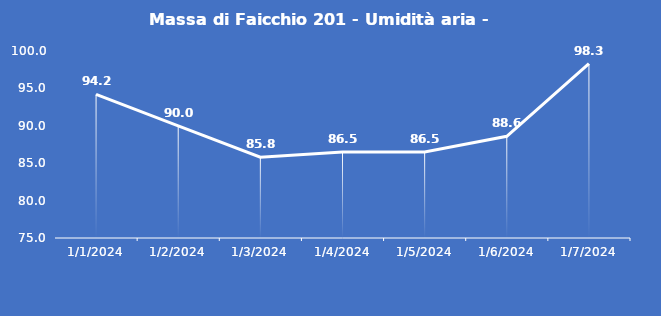
| Category | Massa di Faicchio 201 - Umidità aria - Grezzo (%) |
|---|---|
| 1/1/24 | 94.2 |
| 1/2/24 | 90 |
| 1/3/24 | 85.8 |
| 1/4/24 | 86.5 |
| 1/5/24 | 86.5 |
| 1/6/24 | 88.6 |
| 1/7/24 | 98.3 |